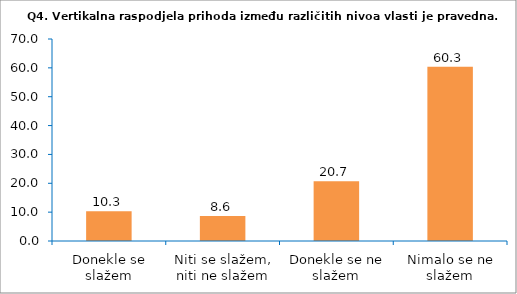
| Category | Series 0 |
|---|---|
| Donekle se slažem | 10.345 |
| Niti se slažem, niti ne slažem | 8.621 |
| Donekle se ne slažem | 20.69 |
| Nimalo se ne slažem | 60.345 |